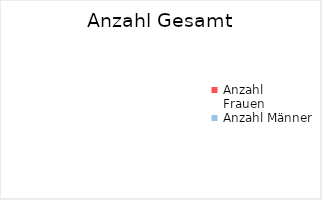
| Category | Gesamt | Stellvertretung (PL) | Projektmitarbeit (wissenschaftlich) | Projektmitarbeit (technisch) | Projektmitarbeit (administrativ) |
|---|---|---|---|---|---|
| Anzahl 
Frauen | 0 | 0 | 0 | 0 | 0 |
| Anzahl Männer | 0 | 0 | 0 | 0 | 0 |